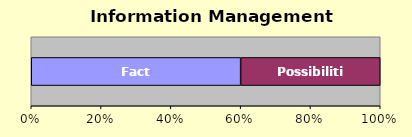
| Category | Facts | Possibilities |
|---|---|---|
| 0 | 3 | 2 |